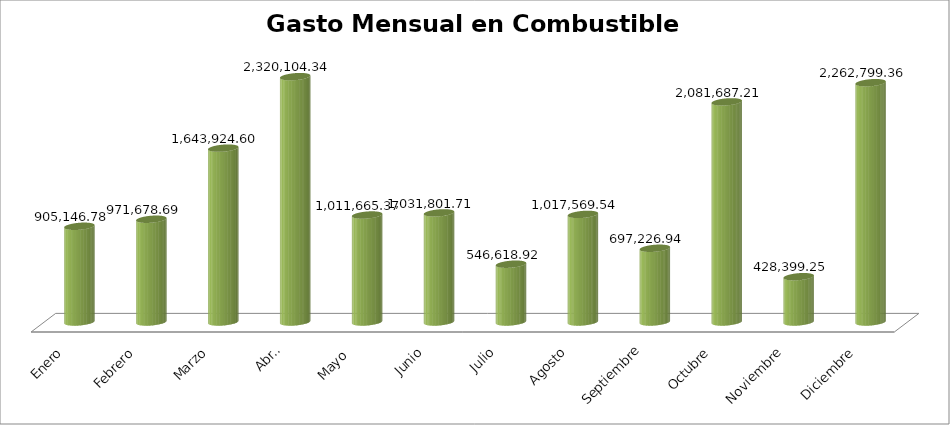
| Category | Suma |
|---|---|
| Enero | 905146.78 |
| Febrero | 971678.69 |
| Marzo | 1643924.6 |
| Abril | 2320104.34 |
| Mayo  | 1011665.37 |
| Junio | 1031801.71 |
| Julio | 546618.92 |
| Agosto | 1017569.54 |
| Septiembre | 697226.94 |
| Octubre | 2081687.21 |
| Noviembre | 428399.25 |
| Diciembre | 2262799.36 |